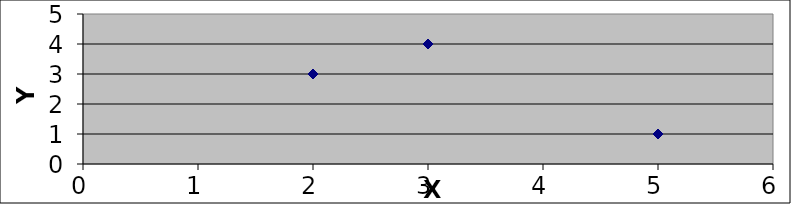
| Category | Series 0 |
|---|---|
| 2.0 | 3 |
| 3.0 | 4 |
| 5.0 | 1 |